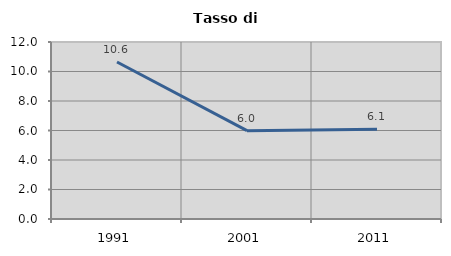
| Category | Tasso di disoccupazione   |
|---|---|
| 1991.0 | 10.645 |
| 2001.0 | 5.988 |
| 2011.0 | 6.086 |